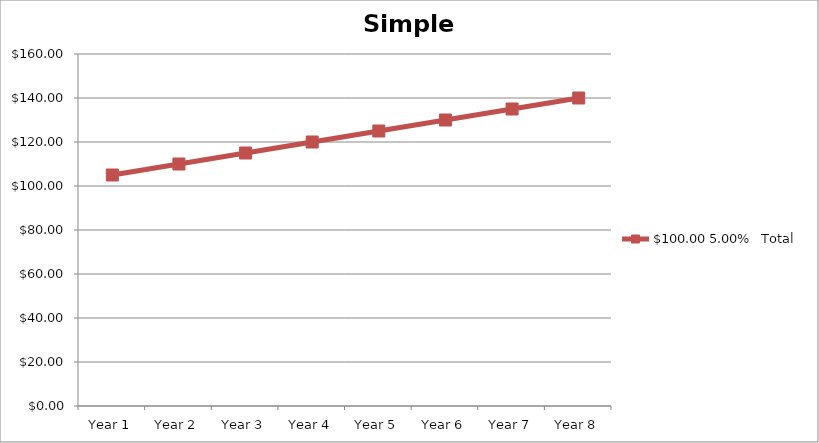
| Category | $100.00 5.00% Total |
|---|---|
| Year 1 | 105 |
| Year 2 | 110 |
| Year 3 | 115 |
| Year 4 | 120 |
| Year 5 | 125 |
| Year 6 | 130 |
| Year 7 | 135 |
| Year 8 | 140 |